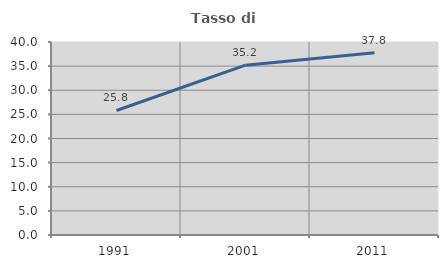
| Category | Tasso di occupazione   |
|---|---|
| 1991.0 | 25.806 |
| 2001.0 | 35.19 |
| 2011.0 | 37.789 |